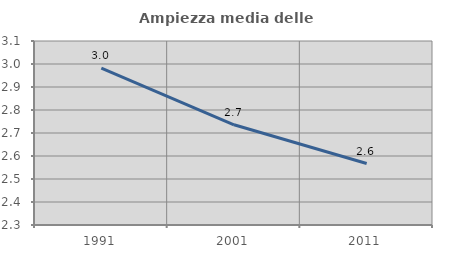
| Category | Ampiezza media delle famiglie |
|---|---|
| 1991.0 | 2.982 |
| 2001.0 | 2.736 |
| 2011.0 | 2.567 |